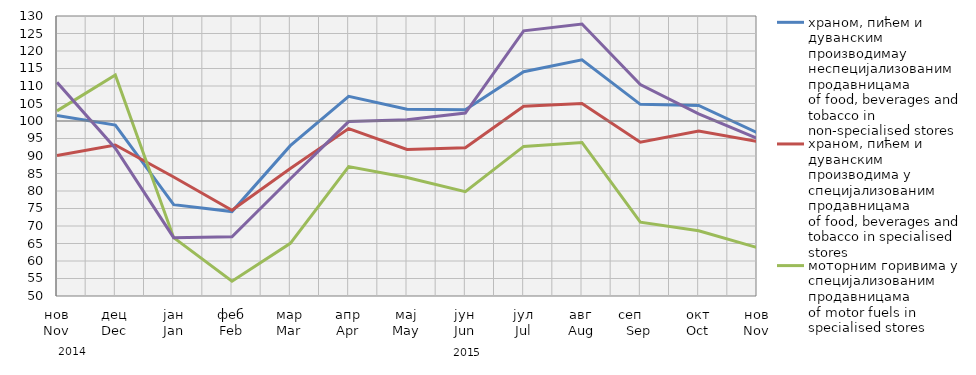
| Category | храном, пићем и дуванским производимау неспецијализованим продавницама
of food, beverages and tobacco in non-specialised stores
 | храном, пићем и дуванским производима у специјализовaним продавницама
of food, beverages and tobacco in specialised stores | моторним горивима у специјализованим продавницама
of motor fuels in specialised stores | остала
other |
|---|---|---|---|---|
| нов
Nov | 101.543 | 90.168 | 102.886 | 111.05 |
| дец
Dec | 98.841 | 93.152 | 113.178 | 92.21 |
| јан
Jan | 76.105 | 83.983 | 66.659 | 66.673 |
| феб
Feb | 74.124 | 74.495 | 54.212 | 66.916 |
| мар
Mar | 92.948 | 86.45 | 65.042 | 83.485 |
| апр
Apr | 107.029 | 97.818 | 86.958 | 99.837 |
| мај
May | 103.34 | 91.883 | 83.858 | 100.375 |
| јун
Jun | 103.24 | 92.338 | 79.832 | 102.276 |
| јул
Jul | 114.087 | 104.214 | 92.74 | 125.76 |
| авг
Aug | 117.466 | 104.989 | 93.864 | 127.707 |
| сеп     Sep | 104.752 | 93.955 | 71.088 | 110.411 |
| окт
Oct | 104.453 | 97.122 | 68.621 | 102.068 |
| нов
Nov | 96.708 | 94.151 | 63.847 | 95.032 |